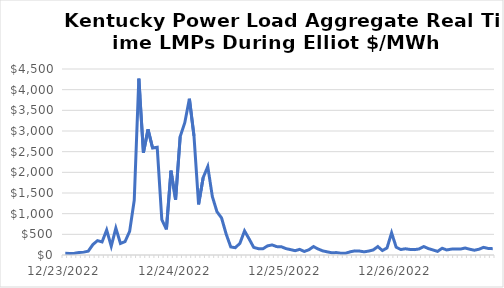
| Category | total_lmp_rt |
|---|---|
| 12/23/22 | 39.526 |
| 12/23/22 | 38.233 |
| 12/23/22 | 43.706 |
| 12/23/22 | 60.863 |
| 12/23/22 | 69.657 |
| 12/23/22 | 93.651 |
| 12/23/22 | 252.823 |
| 12/23/22 | 346.921 |
| 12/23/22 | 314.237 |
| 12/23/22 | 605.268 |
| 12/23/22 | 212.491 |
| 12/23/22 | 650.564 |
| 12/23/22 | 280.197 |
| 12/23/22 | 323.987 |
| 12/23/22 | 572.138 |
| 12/23/22 | 1324.56 |
| 12/23/22 | 4265.802 |
| 12/23/22 | 2474.005 |
| 12/24/22 | 3039.259 |
| 12/24/22 | 2586.47 |
| 12/24/22 | 2604.561 |
| 12/24/22 | 854.086 |
| 12/24/22 | 620.121 |
| 12/24/22 | 2039.211 |
| 12/24/22 | 1337.953 |
| 12/24/22 | 2866.915 |
| 12/24/22 | 3200.034 |
| 12/24/22 | 3779.413 |
| 12/24/22 | 2882.638 |
| 12/24/22 | 1224.107 |
| 12/24/22 | 1872.913 |
| 12/24/22 | 2139.758 |
| 12/24/22 | 1412.839 |
| 12/24/22 | 1047.348 |
| 12/24/22 | 897.064 |
| 12/24/22 | 507.323 |
| 12/24/22 | 195.63 |
| 12/24/22 | 176.441 |
| 12/24/22 | 283.772 |
| 12/24/22 | 582.843 |
| 12/24/22 | 388.482 |
| 12/24/22 | 183.647 |
| 12/25/22 | 153.412 |
| 12/25/22 | 150.373 |
| 12/25/22 | 220.613 |
| 12/25/22 | 243.798 |
| 12/25/22 | 202.699 |
| 12/25/22 | 200.376 |
| 12/25/22 | 155.026 |
| 12/25/22 | 130.641 |
| 12/25/22 | 104.236 |
| 12/25/22 | 135.983 |
| 12/25/22 | 85.854 |
| 12/25/22 | 126.258 |
| 12/25/22 | 204.126 |
| 12/25/22 | 146.166 |
| 12/25/22 | 99.629 |
| 12/25/22 | 76.634 |
| 12/25/22 | 54.307 |
| 12/25/22 | 58.33 |
| 12/25/22 | 42.387 |
| 12/25/22 | 42.262 |
| 12/25/22 | 77.809 |
| 12/25/22 | 99.921 |
| 12/25/22 | 95.775 |
| 12/25/22 | 76.441 |
| 12/26/22 | 94.307 |
| 12/26/22 | 122.236 |
| 12/26/22 | 203.765 |
| 12/26/22 | 108.133 |
| 12/26/22 | 169.789 |
| 12/26/22 | 536.73 |
| 12/26/22 | 188.264 |
| 12/26/22 | 132.892 |
| 12/26/22 | 150.615 |
| 12/26/22 | 134.993 |
| 12/26/22 | 130.014 |
| 12/26/22 | 146.915 |
| 12/26/22 | 204.905 |
| 12/26/22 | 155.487 |
| 12/26/22 | 122.369 |
| 12/26/22 | 87.418 |
| 12/26/22 | 162.73 |
| 12/26/22 | 122.193 |
| 12/26/22 | 141.924 |
| 12/26/22 | 147.634 |
| 12/26/22 | 143.852 |
| 12/26/22 | 168.887 |
| 12/26/22 | 139.554 |
| 12/26/22 | 115.397 |
| 12/27/22 | 138.862 |
| 12/27/22 | 184.78 |
| 12/27/22 | 159.227 |
| 12/27/22 | 152.983 |